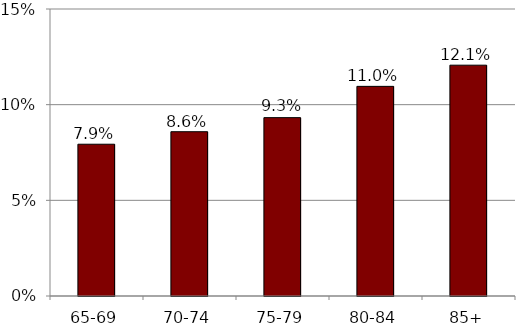
| Category | Series 0 |
|---|---|
| 65-69 | 0.079 |
| 70-74 | 0.086 |
| 75-79 | 0.093 |
| 80-84 | 0.11 |
| 85+ | 0.121 |